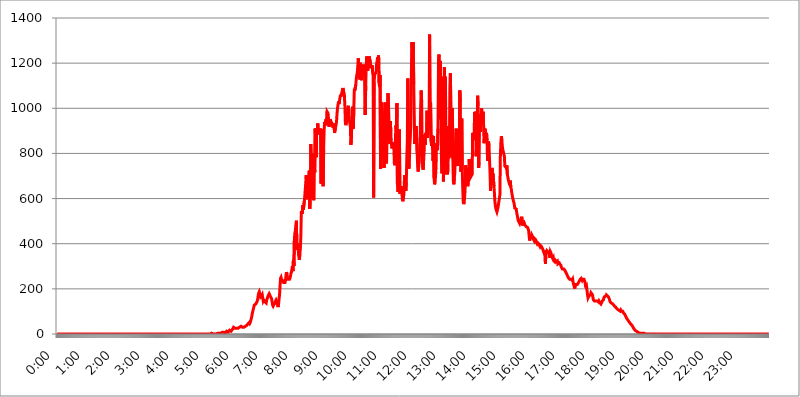
| Category | 2015.05.05. Intenzitás [W/m^2] |
|---|---|
| 0.0 | 0 |
| 0.0006944444444444445 | 0 |
| 0.001388888888888889 | 0 |
| 0.0020833333333333333 | 0 |
| 0.002777777777777778 | 0 |
| 0.003472222222222222 | 0 |
| 0.004166666666666667 | 0 |
| 0.004861111111111111 | 0 |
| 0.005555555555555556 | 0 |
| 0.0062499999999999995 | 0 |
| 0.006944444444444444 | 0 |
| 0.007638888888888889 | 0 |
| 0.008333333333333333 | 0 |
| 0.009027777777777779 | 0 |
| 0.009722222222222222 | 0 |
| 0.010416666666666666 | 0 |
| 0.011111111111111112 | 0 |
| 0.011805555555555555 | 0 |
| 0.012499999999999999 | 0 |
| 0.013194444444444444 | 0 |
| 0.013888888888888888 | 0 |
| 0.014583333333333332 | 0 |
| 0.015277777777777777 | 0 |
| 0.015972222222222224 | 0 |
| 0.016666666666666666 | 0 |
| 0.017361111111111112 | 0 |
| 0.018055555555555557 | 0 |
| 0.01875 | 0 |
| 0.019444444444444445 | 0 |
| 0.02013888888888889 | 0 |
| 0.020833333333333332 | 0 |
| 0.02152777777777778 | 0 |
| 0.022222222222222223 | 0 |
| 0.02291666666666667 | 0 |
| 0.02361111111111111 | 0 |
| 0.024305555555555556 | 0 |
| 0.024999999999999998 | 0 |
| 0.025694444444444447 | 0 |
| 0.02638888888888889 | 0 |
| 0.027083333333333334 | 0 |
| 0.027777777777777776 | 0 |
| 0.02847222222222222 | 0 |
| 0.029166666666666664 | 0 |
| 0.029861111111111113 | 0 |
| 0.030555555555555555 | 0 |
| 0.03125 | 0 |
| 0.03194444444444445 | 0 |
| 0.03263888888888889 | 0 |
| 0.03333333333333333 | 0 |
| 0.034027777777777775 | 0 |
| 0.034722222222222224 | 0 |
| 0.035416666666666666 | 0 |
| 0.036111111111111115 | 0 |
| 0.03680555555555556 | 0 |
| 0.0375 | 0 |
| 0.03819444444444444 | 0 |
| 0.03888888888888889 | 0 |
| 0.03958333333333333 | 0 |
| 0.04027777777777778 | 0 |
| 0.04097222222222222 | 0 |
| 0.041666666666666664 | 0 |
| 0.042361111111111106 | 0 |
| 0.04305555555555556 | 0 |
| 0.043750000000000004 | 0 |
| 0.044444444444444446 | 0 |
| 0.04513888888888889 | 0 |
| 0.04583333333333334 | 0 |
| 0.04652777777777778 | 0 |
| 0.04722222222222222 | 0 |
| 0.04791666666666666 | 0 |
| 0.04861111111111111 | 0 |
| 0.049305555555555554 | 0 |
| 0.049999999999999996 | 0 |
| 0.05069444444444445 | 0 |
| 0.051388888888888894 | 0 |
| 0.052083333333333336 | 0 |
| 0.05277777777777778 | 0 |
| 0.05347222222222222 | 0 |
| 0.05416666666666667 | 0 |
| 0.05486111111111111 | 0 |
| 0.05555555555555555 | 0 |
| 0.05625 | 0 |
| 0.05694444444444444 | 0 |
| 0.057638888888888885 | 0 |
| 0.05833333333333333 | 0 |
| 0.05902777777777778 | 0 |
| 0.059722222222222225 | 0 |
| 0.06041666666666667 | 0 |
| 0.061111111111111116 | 0 |
| 0.06180555555555556 | 0 |
| 0.0625 | 0 |
| 0.06319444444444444 | 0 |
| 0.06388888888888888 | 0 |
| 0.06458333333333334 | 0 |
| 0.06527777777777778 | 0 |
| 0.06597222222222222 | 0 |
| 0.06666666666666667 | 0 |
| 0.06736111111111111 | 0 |
| 0.06805555555555555 | 0 |
| 0.06874999999999999 | 0 |
| 0.06944444444444443 | 0 |
| 0.07013888888888889 | 0 |
| 0.07083333333333333 | 0 |
| 0.07152777777777779 | 0 |
| 0.07222222222222223 | 0 |
| 0.07291666666666667 | 0 |
| 0.07361111111111111 | 0 |
| 0.07430555555555556 | 0 |
| 0.075 | 0 |
| 0.07569444444444444 | 0 |
| 0.0763888888888889 | 0 |
| 0.07708333333333334 | 0 |
| 0.07777777777777778 | 0 |
| 0.07847222222222222 | 0 |
| 0.07916666666666666 | 0 |
| 0.0798611111111111 | 0 |
| 0.08055555555555556 | 0 |
| 0.08125 | 0 |
| 0.08194444444444444 | 0 |
| 0.08263888888888889 | 0 |
| 0.08333333333333333 | 0 |
| 0.08402777777777777 | 0 |
| 0.08472222222222221 | 0 |
| 0.08541666666666665 | 0 |
| 0.08611111111111112 | 0 |
| 0.08680555555555557 | 0 |
| 0.08750000000000001 | 0 |
| 0.08819444444444445 | 0 |
| 0.08888888888888889 | 0 |
| 0.08958333333333333 | 0 |
| 0.09027777777777778 | 0 |
| 0.09097222222222222 | 0 |
| 0.09166666666666667 | 0 |
| 0.09236111111111112 | 0 |
| 0.09305555555555556 | 0 |
| 0.09375 | 0 |
| 0.09444444444444444 | 0 |
| 0.09513888888888888 | 0 |
| 0.09583333333333333 | 0 |
| 0.09652777777777777 | 0 |
| 0.09722222222222222 | 0 |
| 0.09791666666666667 | 0 |
| 0.09861111111111111 | 0 |
| 0.09930555555555555 | 0 |
| 0.09999999999999999 | 0 |
| 0.10069444444444443 | 0 |
| 0.1013888888888889 | 0 |
| 0.10208333333333335 | 0 |
| 0.10277777777777779 | 0 |
| 0.10347222222222223 | 0 |
| 0.10416666666666667 | 0 |
| 0.10486111111111111 | 0 |
| 0.10555555555555556 | 0 |
| 0.10625 | 0 |
| 0.10694444444444444 | 0 |
| 0.1076388888888889 | 0 |
| 0.10833333333333334 | 0 |
| 0.10902777777777778 | 0 |
| 0.10972222222222222 | 0 |
| 0.1111111111111111 | 0 |
| 0.11180555555555556 | 0 |
| 0.11180555555555556 | 0 |
| 0.1125 | 0 |
| 0.11319444444444444 | 0 |
| 0.11388888888888889 | 0 |
| 0.11458333333333333 | 0 |
| 0.11527777777777777 | 0 |
| 0.11597222222222221 | 0 |
| 0.11666666666666665 | 0 |
| 0.1173611111111111 | 0 |
| 0.11805555555555557 | 0 |
| 0.11944444444444445 | 0 |
| 0.12013888888888889 | 0 |
| 0.12083333333333333 | 0 |
| 0.12152777777777778 | 0 |
| 0.12222222222222223 | 0 |
| 0.12291666666666667 | 0 |
| 0.12291666666666667 | 0 |
| 0.12361111111111112 | 0 |
| 0.12430555555555556 | 0 |
| 0.125 | 0 |
| 0.12569444444444444 | 0 |
| 0.12638888888888888 | 0 |
| 0.12708333333333333 | 0 |
| 0.16875 | 0 |
| 0.12847222222222224 | 0 |
| 0.12916666666666668 | 0 |
| 0.12986111111111112 | 0 |
| 0.13055555555555556 | 0 |
| 0.13125 | 0 |
| 0.13194444444444445 | 0 |
| 0.1326388888888889 | 0 |
| 0.13333333333333333 | 0 |
| 0.13402777777777777 | 0 |
| 0.13402777777777777 | 0 |
| 0.13472222222222222 | 0 |
| 0.13541666666666666 | 0 |
| 0.1361111111111111 | 0 |
| 0.13749999999999998 | 0 |
| 0.13819444444444443 | 0 |
| 0.1388888888888889 | 0 |
| 0.13958333333333334 | 0 |
| 0.14027777777777778 | 0 |
| 0.14097222222222222 | 0 |
| 0.14166666666666666 | 0 |
| 0.1423611111111111 | 0 |
| 0.14305555555555557 | 0 |
| 0.14375000000000002 | 0 |
| 0.14444444444444446 | 0 |
| 0.1451388888888889 | 0 |
| 0.1451388888888889 | 0 |
| 0.14652777777777778 | 0 |
| 0.14722222222222223 | 0 |
| 0.14791666666666667 | 0 |
| 0.1486111111111111 | 0 |
| 0.14930555555555555 | 0 |
| 0.15 | 0 |
| 0.15069444444444444 | 0 |
| 0.15138888888888888 | 0 |
| 0.15208333333333332 | 0 |
| 0.15277777777777776 | 0 |
| 0.15347222222222223 | 0 |
| 0.15416666666666667 | 0 |
| 0.15486111111111112 | 0 |
| 0.15555555555555556 | 0 |
| 0.15625 | 0 |
| 0.15694444444444444 | 0 |
| 0.15763888888888888 | 0 |
| 0.15833333333333333 | 0 |
| 0.15902777777777777 | 0 |
| 0.15972222222222224 | 0 |
| 0.16041666666666668 | 0 |
| 0.16111111111111112 | 0 |
| 0.16180555555555556 | 0 |
| 0.1625 | 0 |
| 0.16319444444444445 | 0 |
| 0.1638888888888889 | 0 |
| 0.16458333333333333 | 0 |
| 0.16527777777777777 | 0 |
| 0.16597222222222222 | 0 |
| 0.16666666666666666 | 0 |
| 0.1673611111111111 | 0 |
| 0.16805555555555554 | 0 |
| 0.16874999999999998 | 0 |
| 0.16944444444444443 | 0 |
| 0.17013888888888887 | 0 |
| 0.1708333333333333 | 0 |
| 0.17152777777777775 | 0 |
| 0.17222222222222225 | 0 |
| 0.1729166666666667 | 0 |
| 0.17361111111111113 | 0 |
| 0.17430555555555557 | 0 |
| 0.17500000000000002 | 0 |
| 0.17569444444444446 | 0 |
| 0.1763888888888889 | 0 |
| 0.17708333333333334 | 0 |
| 0.17777777777777778 | 0 |
| 0.17847222222222223 | 0 |
| 0.17916666666666667 | 0 |
| 0.1798611111111111 | 0 |
| 0.18055555555555555 | 0 |
| 0.18125 | 0 |
| 0.18194444444444444 | 0 |
| 0.1826388888888889 | 0 |
| 0.18333333333333335 | 0 |
| 0.1840277777777778 | 0 |
| 0.18472222222222223 | 0 |
| 0.18541666666666667 | 0 |
| 0.18611111111111112 | 0 |
| 0.18680555555555556 | 0 |
| 0.1875 | 0 |
| 0.18819444444444444 | 0 |
| 0.18888888888888888 | 0 |
| 0.18958333333333333 | 0 |
| 0.19027777777777777 | 0 |
| 0.1909722222222222 | 0 |
| 0.19166666666666665 | 0 |
| 0.19236111111111112 | 0 |
| 0.19305555555555554 | 0 |
| 0.19375 | 0 |
| 0.19444444444444445 | 0 |
| 0.1951388888888889 | 0 |
| 0.19583333333333333 | 0 |
| 0.19652777777777777 | 0 |
| 0.19722222222222222 | 0 |
| 0.19791666666666666 | 0 |
| 0.1986111111111111 | 0 |
| 0.19930555555555554 | 0 |
| 0.19999999999999998 | 0 |
| 0.20069444444444443 | 0 |
| 0.20138888888888887 | 0 |
| 0.2020833333333333 | 0 |
| 0.2027777777777778 | 0 |
| 0.2034722222222222 | 0 |
| 0.2041666666666667 | 0 |
| 0.20486111111111113 | 0 |
| 0.20555555555555557 | 0 |
| 0.20625000000000002 | 0 |
| 0.20694444444444446 | 0 |
| 0.2076388888888889 | 0 |
| 0.20833333333333334 | 0 |
| 0.20902777777777778 | 0 |
| 0.20972222222222223 | 0 |
| 0.21041666666666667 | 0 |
| 0.2111111111111111 | 0 |
| 0.21180555555555555 | 0 |
| 0.2125 | 0 |
| 0.21319444444444444 | 0 |
| 0.2138888888888889 | 0 |
| 0.21458333333333335 | 0 |
| 0.2152777777777778 | 0 |
| 0.21597222222222223 | 3.525 |
| 0.21666666666666667 | 3.525 |
| 0.21736111111111112 | 3.525 |
| 0.21805555555555556 | 3.525 |
| 0.21875 | 0 |
| 0.21944444444444444 | 0 |
| 0.22013888888888888 | 0 |
| 0.22083333333333333 | 0 |
| 0.22152777777777777 | 0 |
| 0.2222222222222222 | 0 |
| 0.22291666666666665 | 0 |
| 0.2236111111111111 | 0 |
| 0.22430555555555556 | 0 |
| 0.225 | 3.525 |
| 0.22569444444444445 | 3.525 |
| 0.2263888888888889 | 3.525 |
| 0.22708333333333333 | 3.525 |
| 0.22777777777777777 | 3.525 |
| 0.22847222222222222 | 3.525 |
| 0.22916666666666666 | 3.525 |
| 0.2298611111111111 | 3.525 |
| 0.23055555555555554 | 3.525 |
| 0.23124999999999998 | 7.887 |
| 0.23194444444444443 | 7.887 |
| 0.23263888888888887 | 7.887 |
| 0.2333333333333333 | 7.887 |
| 0.2340277777777778 | 7.887 |
| 0.2347222222222222 | 3.525 |
| 0.2354166666666667 | 3.525 |
| 0.23611111111111113 | 7.887 |
| 0.23680555555555557 | 7.887 |
| 0.23750000000000002 | 12.257 |
| 0.23819444444444446 | 7.887 |
| 0.2388888888888889 | 7.887 |
| 0.23958333333333334 | 7.887 |
| 0.24027777777777778 | 12.257 |
| 0.24097222222222223 | 12.257 |
| 0.24166666666666667 | 16.636 |
| 0.2423611111111111 | 12.257 |
| 0.24305555555555555 | 12.257 |
| 0.24375 | 12.257 |
| 0.24444444444444446 | 12.257 |
| 0.24513888888888888 | 12.257 |
| 0.24583333333333335 | 21.024 |
| 0.2465277777777778 | 25.419 |
| 0.24722222222222223 | 29.823 |
| 0.24791666666666667 | 29.823 |
| 0.24861111111111112 | 29.823 |
| 0.24930555555555556 | 25.419 |
| 0.25 | 21.024 |
| 0.25069444444444444 | 21.024 |
| 0.2513888888888889 | 25.419 |
| 0.2520833333333333 | 25.419 |
| 0.25277777777777777 | 25.419 |
| 0.2534722222222222 | 25.419 |
| 0.25416666666666665 | 25.419 |
| 0.2548611111111111 | 29.823 |
| 0.2555555555555556 | 29.823 |
| 0.25625000000000003 | 29.823 |
| 0.2569444444444445 | 34.234 |
| 0.2576388888888889 | 34.234 |
| 0.25833333333333336 | 34.234 |
| 0.2590277777777778 | 29.823 |
| 0.25972222222222224 | 29.823 |
| 0.2604166666666667 | 29.823 |
| 0.2611111111111111 | 29.823 |
| 0.26180555555555557 | 29.823 |
| 0.2625 | 29.823 |
| 0.26319444444444445 | 29.823 |
| 0.2638888888888889 | 34.234 |
| 0.26458333333333334 | 38.653 |
| 0.2652777777777778 | 38.653 |
| 0.2659722222222222 | 38.653 |
| 0.26666666666666666 | 43.079 |
| 0.2673611111111111 | 43.079 |
| 0.26805555555555555 | 47.511 |
| 0.26875 | 47.511 |
| 0.26944444444444443 | 51.951 |
| 0.2701388888888889 | 47.511 |
| 0.2708333333333333 | 51.951 |
| 0.27152777777777776 | 60.85 |
| 0.2722222222222222 | 69.775 |
| 0.27291666666666664 | 78.722 |
| 0.2736111111111111 | 92.184 |
| 0.2743055555555555 | 101.184 |
| 0.27499999999999997 | 110.201 |
| 0.27569444444444446 | 119.235 |
| 0.27638888888888885 | 128.284 |
| 0.27708333333333335 | 128.284 |
| 0.2777777777777778 | 128.284 |
| 0.27847222222222223 | 132.814 |
| 0.2791666666666667 | 137.347 |
| 0.2798611111111111 | 141.884 |
| 0.28055555555555556 | 146.423 |
| 0.28125 | 155.509 |
| 0.28194444444444444 | 173.709 |
| 0.2826388888888889 | 182.82 |
| 0.2833333333333333 | 187.378 |
| 0.28402777777777777 | 178.264 |
| 0.2847222222222222 | 173.709 |
| 0.28541666666666665 | 164.605 |
| 0.28611111111111115 | 164.605 |
| 0.28680555555555554 | 169.156 |
| 0.28750000000000003 | 173.709 |
| 0.2881944444444445 | 160.056 |
| 0.2888888888888889 | 146.423 |
| 0.28958333333333336 | 150.964 |
| 0.2902777777777778 | 150.964 |
| 0.29097222222222224 | 146.423 |
| 0.2916666666666667 | 141.884 |
| 0.2923611111111111 | 141.884 |
| 0.29305555555555557 | 137.347 |
| 0.29375 | 150.964 |
| 0.29444444444444445 | 155.509 |
| 0.2951388888888889 | 164.605 |
| 0.29583333333333334 | 169.156 |
| 0.2965277777777778 | 173.709 |
| 0.2972222222222222 | 178.264 |
| 0.29791666666666666 | 173.709 |
| 0.2986111111111111 | 169.156 |
| 0.29930555555555555 | 164.605 |
| 0.3 | 164.605 |
| 0.30069444444444443 | 155.509 |
| 0.3013888888888889 | 141.884 |
| 0.3020833333333333 | 128.284 |
| 0.30277777777777776 | 123.758 |
| 0.3034722222222222 | 128.284 |
| 0.30416666666666664 | 132.814 |
| 0.3048611111111111 | 132.814 |
| 0.3055555555555555 | 137.347 |
| 0.30624999999999997 | 146.423 |
| 0.3069444444444444 | 150.964 |
| 0.3076388888888889 | 146.423 |
| 0.30833333333333335 | 132.814 |
| 0.3090277777777778 | 128.284 |
| 0.30972222222222223 | 119.235 |
| 0.3104166666666667 | 132.814 |
| 0.3111111111111111 | 155.509 |
| 0.31180555555555556 | 173.709 |
| 0.3125 | 214.746 |
| 0.31319444444444444 | 246.689 |
| 0.3138888888888889 | 251.251 |
| 0.3145833333333333 | 242.127 |
| 0.31527777777777777 | 242.127 |
| 0.3159722222222222 | 237.564 |
| 0.31666666666666665 | 233 |
| 0.31736111111111115 | 228.436 |
| 0.31805555555555554 | 228.436 |
| 0.31875000000000003 | 228.436 |
| 0.3194444444444445 | 228.436 |
| 0.3201388888888889 | 237.564 |
| 0.32083333333333336 | 260.373 |
| 0.3215277777777778 | 274.047 |
| 0.32222222222222224 | 264.932 |
| 0.3229166666666667 | 251.251 |
| 0.3236111111111111 | 242.127 |
| 0.32430555555555557 | 242.127 |
| 0.325 | 242.127 |
| 0.32569444444444445 | 242.127 |
| 0.3263888888888889 | 246.689 |
| 0.32708333333333334 | 255.813 |
| 0.3277777777777778 | 269.49 |
| 0.3284722222222222 | 274.047 |
| 0.32916666666666666 | 287.709 |
| 0.3298611111111111 | 301.354 |
| 0.33055555555555555 | 278.603 |
| 0.33125 | 328.584 |
| 0.33194444444444443 | 301.354 |
| 0.3326388888888889 | 422.943 |
| 0.3333333333333333 | 449.551 |
| 0.3340277777777778 | 458.38 |
| 0.3347222222222222 | 484.735 |
| 0.3354166666666667 | 502.192 |
| 0.3361111111111111 | 373.729 |
| 0.3368055555555556 | 400.638 |
| 0.33749999999999997 | 387.202 |
| 0.33819444444444446 | 364.728 |
| 0.33888888888888885 | 369.23 |
| 0.33958333333333335 | 328.584 |
| 0.34027777777777773 | 355.712 |
| 0.34097222222222223 | 378.224 |
| 0.3416666666666666 | 436.27 |
| 0.3423611111111111 | 545.416 |
| 0.3430555555555555 | 549.704 |
| 0.34375 | 532.513 |
| 0.3444444444444445 | 571.049 |
| 0.3451388888888889 | 549.704 |
| 0.3458333333333334 | 545.416 |
| 0.34652777777777777 | 588.009 |
| 0.34722222222222227 | 613.252 |
| 0.34791666666666665 | 642.4 |
| 0.34861111111111115 | 638.256 |
| 0.34930555555555554 | 703.762 |
| 0.35000000000000003 | 609.062 |
| 0.3506944444444444 | 609.062 |
| 0.3513888888888889 | 596.45 |
| 0.3520833333333333 | 592.233 |
| 0.3527777777777778 | 695.666 |
| 0.3534722222222222 | 723.889 |
| 0.3541666666666667 | 553.986 |
| 0.3548611111111111 | 617.436 |
| 0.35555555555555557 | 841.526 |
| 0.35625 | 759.723 |
| 0.35694444444444445 | 600.661 |
| 0.3576388888888889 | 759.723 |
| 0.35833333333333334 | 798.974 |
| 0.3590277777777778 | 787.258 |
| 0.3597222222222222 | 592.233 |
| 0.36041666666666666 | 771.559 |
| 0.3611111111111111 | 715.858 |
| 0.36180555555555555 | 909.996 |
| 0.3625 | 856.855 |
| 0.36319444444444443 | 783.342 |
| 0.3638888888888889 | 906.223 |
| 0.3645833333333333 | 883.516 |
| 0.3652777777777778 | 932.576 |
| 0.3659722222222222 | 909.996 |
| 0.3666666666666667 | 898.668 |
| 0.3673611111111111 | 906.223 |
| 0.3680555555555556 | 894.885 |
| 0.36874999999999997 | 898.668 |
| 0.36944444444444446 | 909.996 |
| 0.37013888888888885 | 667.123 |
| 0.37083333333333335 | 906.223 |
| 0.37152777777777773 | 868.305 |
| 0.37222222222222223 | 739.877 |
| 0.3729166666666666 | 654.791 |
| 0.3736111111111111 | 818.392 |
| 0.3743055555555555 | 902.447 |
| 0.375 | 940.082 |
| 0.3756944444444445 | 928.819 |
| 0.3763888888888889 | 928.819 |
| 0.3770833333333334 | 951.327 |
| 0.37777777777777777 | 925.06 |
| 0.37847222222222227 | 984.98 |
| 0.37916666666666665 | 984.98 |
| 0.37986111111111115 | 977.508 |
| 0.38055555555555554 | 973.772 |
| 0.38125000000000003 | 917.534 |
| 0.3819444444444444 | 917.534 |
| 0.3826388888888889 | 951.327 |
| 0.3833333333333333 | 955.071 |
| 0.3840277777777778 | 940.082 |
| 0.3847222222222222 | 940.082 |
| 0.3854166666666667 | 932.576 |
| 0.3861111111111111 | 936.33 |
| 0.38680555555555557 | 913.766 |
| 0.3875 | 921.298 |
| 0.38819444444444445 | 932.576 |
| 0.3888888888888889 | 891.099 |
| 0.38958333333333334 | 891.099 |
| 0.3902777777777778 | 913.766 |
| 0.3909722222222222 | 917.534 |
| 0.39166666666666666 | 940.082 |
| 0.3923611111111111 | 973.772 |
| 0.39305555555555555 | 999.916 |
| 0.39375 | 996.182 |
| 0.39444444444444443 | 1029.798 |
| 0.3951388888888889 | 1018.587 |
| 0.3958333333333333 | 1033.537 |
| 0.3965277777777778 | 1029.798 |
| 0.3972222222222222 | 1059.756 |
| 0.3979166666666667 | 1052.255 |
| 0.3986111111111111 | 1063.51 |
| 0.3993055555555556 | 1071.027 |
| 0.39999999999999997 | 1082.324 |
| 0.40069444444444446 | 1089.873 |
| 0.40138888888888885 | 1089.873 |
| 0.40208333333333335 | 1089.873 |
| 0.40277777777777773 | 1052.255 |
| 0.40347222222222223 | 1007.383 |
| 0.4041666666666666 | 932.576 |
| 0.4048611111111111 | 925.06 |
| 0.4055555555555555 | 940.082 |
| 0.40625 | 943.832 |
| 0.4069444444444445 | 988.714 |
| 0.4076388888888889 | 1003.65 |
| 0.4083333333333334 | 1011.118 |
| 0.40902777777777777 | 981.244 |
| 0.40972222222222227 | 947.58 |
| 0.41041666666666665 | 932.576 |
| 0.41111111111111115 | 917.534 |
| 0.41180555555555554 | 837.682 |
| 0.41250000000000003 | 860.676 |
| 0.4131944444444444 | 936.33 |
| 0.4138888888888889 | 992.448 |
| 0.4145833333333333 | 1007.383 |
| 0.4152777777777778 | 909.996 |
| 0.4159722222222222 | 1003.65 |
| 0.4166666666666667 | 1086.097 |
| 0.4173611111111111 | 1078.555 |
| 0.41805555555555557 | 1074.789 |
| 0.41875 | 1105.019 |
| 0.41944444444444445 | 1131.708 |
| 0.4201388888888889 | 1147.086 |
| 0.42083333333333334 | 1158.689 |
| 0.4215277777777778 | 1186.03 |
| 0.4222222222222222 | 1221.83 |
| 0.42291666666666666 | 1217.812 |
| 0.4236111111111111 | 1162.571 |
| 0.42430555555555555 | 1127.879 |
| 0.425 | 1201.843 |
| 0.42569444444444443 | 1154.814 |
| 0.4263888888888889 | 1150.946 |
| 0.4270833333333333 | 1124.056 |
| 0.4277777777777778 | 1174.263 |
| 0.4284722222222222 | 1150.946 |
| 0.4291666666666667 | 1186.03 |
| 0.4298611111111111 | 1193.918 |
| 0.4305555555555556 | 1166.46 |
| 0.43124999999999997 | 1186.03 |
| 0.43194444444444446 | 970.034 |
| 0.43263888888888885 | 1101.226 |
| 0.43333333333333335 | 1186.03 |
| 0.43402777777777773 | 1229.899 |
| 0.43472222222222223 | 1229.899 |
| 0.4354166666666666 | 1166.46 |
| 0.4361111111111111 | 1189.969 |
| 0.4368055555555555 | 1186.03 |
| 0.4375 | 1229.899 |
| 0.4381944444444445 | 1229.899 |
| 0.4388888888888889 | 1205.82 |
| 0.4395833333333334 | 1178.177 |
| 0.44027777777777777 | 1186.03 |
| 0.44097222222222227 | 1178.177 |
| 0.44166666666666665 | 1189.969 |
| 0.44236111111111115 | 1158.689 |
| 0.44305555555555554 | 1143.232 |
| 0.44375000000000003 | 604.864 |
| 0.4444444444444444 | 1116.426 |
| 0.4451388888888889 | 1147.086 |
| 0.4458333333333333 | 1147.086 |
| 0.4465277777777778 | 1143.232 |
| 0.4472222222222222 | 1162.571 |
| 0.4479166666666667 | 1197.876 |
| 0.4486111111111111 | 1209.807 |
| 0.44930555555555557 | 1225.859 |
| 0.45 | 1213.804 |
| 0.45069444444444445 | 1233.951 |
| 0.4513888888888889 | 1112.618 |
| 0.45208333333333334 | 1093.653 |
| 0.4527777777777778 | 1147.086 |
| 0.4534722222222222 | 731.896 |
| 0.45416666666666666 | 1026.06 |
| 0.4548611111111111 | 1026.06 |
| 0.45555555555555555 | 1014.852 |
| 0.45625 | 977.508 |
| 0.45694444444444443 | 775.492 |
| 0.4576388888888889 | 822.26 |
| 0.4583333333333333 | 735.89 |
| 0.4590277777777778 | 856.855 |
| 0.4597222222222222 | 1026.06 |
| 0.4604166666666667 | 1007.383 |
| 0.4611111111111111 | 763.674 |
| 0.4618055555555556 | 755.766 |
| 0.46249999999999997 | 970.034 |
| 0.46319444444444446 | 1022.323 |
| 0.46388888888888885 | 1067.267 |
| 0.46458333333333335 | 1014.852 |
| 0.46527777777777773 | 943.832 |
| 0.46597222222222223 | 853.029 |
| 0.4666666666666666 | 841.526 |
| 0.4673611111111111 | 943.832 |
| 0.4680555555555555 | 849.199 |
| 0.46875 | 841.526 |
| 0.4694444444444445 | 822.26 |
| 0.4701388888888889 | 837.682 |
| 0.4708333333333334 | 849.199 |
| 0.47152777777777777 | 841.526 |
| 0.47222222222222227 | 814.519 |
| 0.47291666666666665 | 747.834 |
| 0.47361111111111115 | 779.42 |
| 0.47430555555555554 | 864.493 |
| 0.47500000000000003 | 925.06 |
| 0.4756944444444444 | 906.223 |
| 0.4763888888888889 | 1022.323 |
| 0.4770833333333333 | 667.123 |
| 0.4777777777777778 | 629.948 |
| 0.4784722222222222 | 642.4 |
| 0.4791666666666667 | 654.791 |
| 0.4798611111111111 | 906.223 |
| 0.48055555555555557 | 621.613 |
| 0.48125 | 617.436 |
| 0.48194444444444445 | 642.4 |
| 0.4826388888888889 | 654.791 |
| 0.48333333333333334 | 629.948 |
| 0.4840277777777778 | 596.45 |
| 0.4847222222222222 | 588.009 |
| 0.48541666666666666 | 583.779 |
| 0.4861111111111111 | 621.613 |
| 0.48680555555555555 | 675.311 |
| 0.4875 | 703.762 |
| 0.48819444444444443 | 663.019 |
| 0.4888888888888889 | 634.105 |
| 0.4895833333333333 | 671.22 |
| 0.4902777777777778 | 783.342 |
| 0.4909722222222222 | 849.199 |
| 0.4916666666666667 | 1131.708 |
| 0.4923611111111111 | 913.766 |
| 0.4930555555555556 | 731.896 |
| 0.49374999999999997 | 751.803 |
| 0.49444444444444446 | 833.834 |
| 0.49513888888888885 | 864.493 |
| 0.49583333333333335 | 921.298 |
| 0.49652777777777773 | 1108.816 |
| 0.49722222222222223 | 1291.997 |
| 0.4979166666666666 | 1287.761 |
| 0.4986111111111111 | 1246.176 |
| 0.4993055555555555 | 1291.997 |
| 0.5 | 1105.019 |
| 0.5006944444444444 | 970.034 |
| 0.5013888888888889 | 841.526 |
| 0.5020833333333333 | 898.668 |
| 0.5027777777777778 | 913.766 |
| 0.5034722222222222 | 921.298 |
| 0.5041666666666667 | 917.534 |
| 0.5048611111111111 | 798.974 |
| 0.5055555555555555 | 735.89 |
| 0.50625 | 719.877 |
| 0.5069444444444444 | 743.859 |
| 0.5076388888888889 | 759.723 |
| 0.5083333333333333 | 810.641 |
| 0.5090277777777777 | 864.493 |
| 0.5097222222222222 | 1007.383 |
| 0.5104166666666666 | 1078.555 |
| 0.5111111111111112 | 1029.798 |
| 0.5118055555555555 | 814.519 |
| 0.5125000000000001 | 735.89 |
| 0.5131944444444444 | 727.896 |
| 0.513888888888889 | 771.559 |
| 0.5145833333333333 | 810.641 |
| 0.5152777777777778 | 883.516 |
| 0.5159722222222222 | 837.682 |
| 0.5166666666666667 | 891.099 |
| 0.517361111111111 | 883.516 |
| 0.5180555555555556 | 875.918 |
| 0.5187499999999999 | 988.714 |
| 0.5194444444444445 | 868.305 |
| 0.5201388888888888 | 906.223 |
| 0.5208333333333334 | 902.447 |
| 0.5215277777777778 | 917.534 |
| 0.5222222222222223 | 1326.445 |
| 0.5229166666666667 | 962.555 |
| 0.5236111111111111 | 1026.06 |
| 0.5243055555555556 | 853.029 |
| 0.525 | 833.834 |
| 0.5256944444444445 | 879.719 |
| 0.5263888888888889 | 826.123 |
| 0.5270833333333333 | 767.62 |
| 0.5277777777777778 | 875.918 |
| 0.5284722222222222 | 691.608 |
| 0.5291666666666667 | 663.019 |
| 0.5298611111111111 | 671.22 |
| 0.5305555555555556 | 699.717 |
| 0.53125 | 739.877 |
| 0.5319444444444444 | 845.365 |
| 0.5326388888888889 | 849.199 |
| 0.5333333333333333 | 814.519 |
| 0.5340277777777778 | 909.996 |
| 0.5347222222222222 | 1209.807 |
| 0.5354166666666667 | 1238.014 |
| 0.5361111111111111 | 951.327 |
| 0.5368055555555555 | 1209.807 |
| 0.5375 | 1197.876 |
| 0.5381944444444444 | 1014.852 |
| 0.5388888888888889 | 767.62 |
| 0.5395833333333333 | 711.832 |
| 0.5402777777777777 | 1139.384 |
| 0.5409722222222222 | 1101.226 |
| 0.5416666666666666 | 675.311 |
| 0.5423611111111112 | 1022.323 |
| 0.5430555555555555 | 1182.099 |
| 0.5437500000000001 | 928.819 |
| 0.5444444444444444 | 1139.384 |
| 0.545138888888889 | 715.858 |
| 0.5458333333333333 | 707.8 |
| 0.5465277777777778 | 921.298 |
| 0.5472222222222222 | 707.8 |
| 0.5479166666666667 | 727.896 |
| 0.548611111111111 | 822.26 |
| 0.5493055555555556 | 779.42 |
| 0.5499999999999999 | 826.123 |
| 0.5506944444444445 | 1097.437 |
| 0.5513888888888888 | 1154.814 |
| 0.5520833333333334 | 1154.814 |
| 0.5527777777777778 | 787.258 |
| 0.5534722222222223 | 883.516 |
| 0.5541666666666667 | 999.916 |
| 0.5548611111111111 | 775.492 |
| 0.5555555555555556 | 675.311 |
| 0.55625 | 663.019 |
| 0.5569444444444445 | 691.608 |
| 0.5576388888888889 | 715.858 |
| 0.5583333333333333 | 719.877 |
| 0.5590277777777778 | 902.447 |
| 0.5597222222222222 | 909.996 |
| 0.5604166666666667 | 849.199 |
| 0.5611111111111111 | 775.492 |
| 0.5618055555555556 | 743.859 |
| 0.5625 | 849.199 |
| 0.5631944444444444 | 833.834 |
| 0.5638888888888889 | 763.674 |
| 0.5645833333333333 | 1078.555 |
| 0.5652777777777778 | 1026.06 |
| 0.5659722222222222 | 719.877 |
| 0.5666666666666667 | 759.723 |
| 0.5673611111111111 | 955.071 |
| 0.5680555555555555 | 727.896 |
| 0.56875 | 642.4 |
| 0.5694444444444444 | 583.779 |
| 0.5701388888888889 | 575.299 |
| 0.5708333333333333 | 588.009 |
| 0.5715277777777777 | 613.252 |
| 0.5722222222222222 | 658.909 |
| 0.5729166666666666 | 747.834 |
| 0.5736111111111112 | 691.608 |
| 0.5743055555555555 | 735.89 |
| 0.5750000000000001 | 675.311 |
| 0.5756944444444444 | 654.791 |
| 0.576388888888889 | 667.123 |
| 0.5770833333333333 | 719.877 |
| 0.5777777777777778 | 775.492 |
| 0.5784722222222222 | 743.859 |
| 0.5791666666666667 | 691.608 |
| 0.579861111111111 | 691.608 |
| 0.5805555555555556 | 699.717 |
| 0.5812499999999999 | 695.666 |
| 0.5819444444444445 | 707.8 |
| 0.5826388888888888 | 891.099 |
| 0.5833333333333334 | 860.676 |
| 0.5840277777777778 | 868.305 |
| 0.5847222222222223 | 894.885 |
| 0.5854166666666667 | 984.98 |
| 0.5861111111111111 | 977.508 |
| 0.5868055555555556 | 921.298 |
| 0.5875 | 787.258 |
| 0.5881944444444445 | 833.834 |
| 0.5888888888888889 | 883.516 |
| 0.5895833333333333 | 1056.004 |
| 0.5902777777777778 | 1011.118 |
| 0.5909722222222222 | 735.89 |
| 0.5916666666666667 | 759.723 |
| 0.5923611111111111 | 973.772 |
| 0.5930555555555556 | 921.298 |
| 0.59375 | 894.885 |
| 0.5944444444444444 | 973.772 |
| 0.5951388888888889 | 999.916 |
| 0.5958333333333333 | 966.295 |
| 0.5965277777777778 | 951.327 |
| 0.5972222222222222 | 984.98 |
| 0.5979166666666667 | 936.33 |
| 0.5986111111111111 | 845.365 |
| 0.5993055555555555 | 872.114 |
| 0.6 | 909.996 |
| 0.6006944444444444 | 872.114 |
| 0.6013888888888889 | 883.516 |
| 0.6020833333333333 | 891.099 |
| 0.6027777777777777 | 856.855 |
| 0.6034722222222222 | 767.62 |
| 0.6041666666666666 | 837.682 |
| 0.6048611111111112 | 853.029 |
| 0.6055555555555555 | 833.834 |
| 0.6062500000000001 | 775.492 |
| 0.6069444444444444 | 719.877 |
| 0.607638888888889 | 634.105 |
| 0.6083333333333333 | 679.395 |
| 0.6090277777777778 | 671.22 |
| 0.6097222222222222 | 735.89 |
| 0.6104166666666667 | 703.762 |
| 0.611111111111111 | 711.832 |
| 0.6118055555555556 | 711.832 |
| 0.6124999999999999 | 654.791 |
| 0.6131944444444445 | 621.613 |
| 0.6138888888888888 | 583.779 |
| 0.6145833333333334 | 566.793 |
| 0.6152777777777778 | 553.986 |
| 0.6159722222222223 | 549.704 |
| 0.6166666666666667 | 541.121 |
| 0.6173611111111111 | 545.416 |
| 0.6180555555555556 | 558.261 |
| 0.61875 | 558.261 |
| 0.6194444444444445 | 588.009 |
| 0.6201388888888889 | 592.233 |
| 0.6208333333333333 | 617.436 |
| 0.6215277777777778 | 795.074 |
| 0.6222222222222222 | 849.199 |
| 0.6229166666666667 | 875.918 |
| 0.6236111111111111 | 856.855 |
| 0.6243055555555556 | 829.981 |
| 0.625 | 814.519 |
| 0.6256944444444444 | 806.757 |
| 0.6263888888888889 | 802.868 |
| 0.6270833333333333 | 787.258 |
| 0.6277777777777778 | 743.859 |
| 0.6284722222222222 | 743.859 |
| 0.6291666666666667 | 747.834 |
| 0.6298611111111111 | 735.89 |
| 0.6305555555555555 | 747.834 |
| 0.63125 | 707.8 |
| 0.6319444444444444 | 703.762 |
| 0.6326388888888889 | 683.473 |
| 0.6333333333333333 | 687.544 |
| 0.6340277777777777 | 683.473 |
| 0.6347222222222222 | 658.909 |
| 0.6354166666666666 | 679.395 |
| 0.6361111111111112 | 650.667 |
| 0.6368055555555555 | 642.4 |
| 0.6375000000000001 | 625.784 |
| 0.6381944444444444 | 621.613 |
| 0.638888888888889 | 600.661 |
| 0.6395833333333333 | 600.661 |
| 0.6402777777777778 | 583.779 |
| 0.6409722222222222 | 575.299 |
| 0.6416666666666667 | 558.261 |
| 0.642361111111111 | 558.261 |
| 0.6430555555555556 | 558.261 |
| 0.6437499999999999 | 553.986 |
| 0.6444444444444445 | 536.82 |
| 0.6451388888888888 | 536.82 |
| 0.6458333333333334 | 515.223 |
| 0.6465277777777778 | 502.192 |
| 0.6472222222222223 | 502.192 |
| 0.6479166666666667 | 502.192 |
| 0.6486111111111111 | 489.108 |
| 0.6493055555555556 | 489.108 |
| 0.65 | 502.192 |
| 0.6506944444444445 | 510.885 |
| 0.6513888888888889 | 519.555 |
| 0.6520833333333333 | 502.192 |
| 0.6527777777777778 | 480.356 |
| 0.6534722222222222 | 502.192 |
| 0.6541666666666667 | 502.192 |
| 0.6548611111111111 | 497.836 |
| 0.6555555555555556 | 484.735 |
| 0.65625 | 489.108 |
| 0.6569444444444444 | 480.356 |
| 0.6576388888888889 | 475.972 |
| 0.6583333333333333 | 471.582 |
| 0.6590277777777778 | 480.356 |
| 0.6597222222222222 | 471.582 |
| 0.6604166666666667 | 467.187 |
| 0.6611111111111111 | 458.38 |
| 0.6618055555555555 | 453.968 |
| 0.6625 | 414.035 |
| 0.6631944444444444 | 422.943 |
| 0.6638888888888889 | 422.943 |
| 0.6645833333333333 | 431.833 |
| 0.6652777777777777 | 440.702 |
| 0.6659722222222222 | 436.27 |
| 0.6666666666666666 | 431.833 |
| 0.6673611111111111 | 427.39 |
| 0.6680555555555556 | 418.492 |
| 0.6687500000000001 | 414.035 |
| 0.6694444444444444 | 422.943 |
| 0.6701388888888888 | 422.943 |
| 0.6708333333333334 | 418.492 |
| 0.6715277777777778 | 418.492 |
| 0.6722222222222222 | 405.108 |
| 0.6729166666666666 | 400.638 |
| 0.6736111111111112 | 405.108 |
| 0.6743055555555556 | 405.108 |
| 0.6749999999999999 | 400.638 |
| 0.6756944444444444 | 396.164 |
| 0.6763888888888889 | 391.685 |
| 0.6770833333333334 | 387.202 |
| 0.6777777777777777 | 391.685 |
| 0.6784722222222223 | 391.685 |
| 0.6791666666666667 | 387.202 |
| 0.6798611111111111 | 382.715 |
| 0.6805555555555555 | 378.224 |
| 0.68125 | 373.729 |
| 0.6819444444444445 | 364.728 |
| 0.6826388888888889 | 360.221 |
| 0.6833333333333332 | 364.728 |
| 0.6840277777777778 | 369.23 |
| 0.6847222222222222 | 310.44 |
| 0.6854166666666667 | 369.23 |
| 0.686111111111111 | 360.221 |
| 0.6868055555555556 | 369.23 |
| 0.6875 | 369.23 |
| 0.6881944444444444 | 364.728 |
| 0.688888888888889 | 360.221 |
| 0.6895833333333333 | 355.712 |
| 0.6902777777777778 | 351.198 |
| 0.6909722222222222 | 337.639 |
| 0.6916666666666668 | 364.728 |
| 0.6923611111111111 | 360.221 |
| 0.6930555555555555 | 351.198 |
| 0.69375 | 342.162 |
| 0.6944444444444445 | 337.639 |
| 0.6951388888888889 | 333.113 |
| 0.6958333333333333 | 337.639 |
| 0.6965277777777777 | 324.052 |
| 0.6972222222222223 | 324.052 |
| 0.6979166666666666 | 319.517 |
| 0.6986111111111111 | 324.052 |
| 0.6993055555555556 | 319.517 |
| 0.7000000000000001 | 319.517 |
| 0.7006944444444444 | 319.517 |
| 0.7013888888888888 | 324.052 |
| 0.7020833333333334 | 310.44 |
| 0.7027777777777778 | 310.44 |
| 0.7034722222222222 | 310.44 |
| 0.7041666666666666 | 314.98 |
| 0.7048611111111112 | 310.44 |
| 0.7055555555555556 | 310.44 |
| 0.7062499999999999 | 305.898 |
| 0.7069444444444444 | 296.808 |
| 0.7076388888888889 | 296.808 |
| 0.7083333333333334 | 287.709 |
| 0.7090277777777777 | 287.709 |
| 0.7097222222222223 | 287.709 |
| 0.7104166666666667 | 287.709 |
| 0.7111111111111111 | 287.709 |
| 0.7118055555555555 | 283.156 |
| 0.7125 | 278.603 |
| 0.7131944444444445 | 274.047 |
| 0.7138888888888889 | 269.49 |
| 0.7145833333333332 | 264.932 |
| 0.7152777777777778 | 260.373 |
| 0.7159722222222222 | 260.373 |
| 0.7166666666666667 | 251.251 |
| 0.717361111111111 | 246.689 |
| 0.7180555555555556 | 246.689 |
| 0.71875 | 242.127 |
| 0.7194444444444444 | 242.127 |
| 0.720138888888889 | 242.127 |
| 0.7208333333333333 | 242.127 |
| 0.7215277777777778 | 242.127 |
| 0.7222222222222222 | 237.564 |
| 0.7229166666666668 | 242.127 |
| 0.7236111111111111 | 228.436 |
| 0.7243055555555555 | 219.309 |
| 0.725 | 210.182 |
| 0.7256944444444445 | 201.058 |
| 0.7263888888888889 | 214.746 |
| 0.7270833333333333 | 219.309 |
| 0.7277777777777777 | 219.309 |
| 0.7284722222222223 | 219.309 |
| 0.7291666666666666 | 219.309 |
| 0.7298611111111111 | 219.309 |
| 0.7305555555555556 | 223.873 |
| 0.7312500000000001 | 228.436 |
| 0.7319444444444444 | 233 |
| 0.7326388888888888 | 237.564 |
| 0.7333333333333334 | 242.127 |
| 0.7340277777777778 | 242.127 |
| 0.7347222222222222 | 246.689 |
| 0.7354166666666666 | 246.689 |
| 0.7361111111111112 | 237.564 |
| 0.7368055555555556 | 242.127 |
| 0.7374999999999999 | 242.127 |
| 0.7381944444444444 | 242.127 |
| 0.7388888888888889 | 242.127 |
| 0.7395833333333334 | 242.127 |
| 0.7402777777777777 | 228.436 |
| 0.7409722222222223 | 210.182 |
| 0.7416666666666667 | 205.62 |
| 0.7423611111111111 | 210.182 |
| 0.7430555555555555 | 191.937 |
| 0.74375 | 173.709 |
| 0.7444444444444445 | 160.056 |
| 0.7451388888888889 | 160.056 |
| 0.7458333333333332 | 169.156 |
| 0.7465277777777778 | 169.156 |
| 0.7472222222222222 | 169.156 |
| 0.7479166666666667 | 173.709 |
| 0.748611111111111 | 182.82 |
| 0.7493055555555556 | 182.82 |
| 0.75 | 182.82 |
| 0.7506944444444444 | 173.709 |
| 0.751388888888889 | 160.056 |
| 0.7520833333333333 | 150.964 |
| 0.7527777777777778 | 150.964 |
| 0.7534722222222222 | 146.423 |
| 0.7541666666666668 | 146.423 |
| 0.7548611111111111 | 146.423 |
| 0.7555555555555555 | 146.423 |
| 0.75625 | 146.423 |
| 0.7569444444444445 | 146.423 |
| 0.7576388888888889 | 146.423 |
| 0.7583333333333333 | 146.423 |
| 0.7590277777777777 | 141.884 |
| 0.7597222222222223 | 146.423 |
| 0.7604166666666666 | 141.884 |
| 0.7611111111111111 | 137.347 |
| 0.7618055555555556 | 137.347 |
| 0.7625000000000001 | 132.814 |
| 0.7631944444444444 | 137.347 |
| 0.7638888888888888 | 141.884 |
| 0.7645833333333334 | 146.423 |
| 0.7652777777777778 | 146.423 |
| 0.7659722222222222 | 150.964 |
| 0.7666666666666666 | 160.056 |
| 0.7673611111111112 | 164.605 |
| 0.7680555555555556 | 164.605 |
| 0.7687499999999999 | 164.605 |
| 0.7694444444444444 | 169.156 |
| 0.7701388888888889 | 173.709 |
| 0.7708333333333334 | 173.709 |
| 0.7715277777777777 | 169.156 |
| 0.7722222222222223 | 169.156 |
| 0.7729166666666667 | 164.605 |
| 0.7736111111111111 | 160.056 |
| 0.7743055555555555 | 155.509 |
| 0.775 | 146.423 |
| 0.7756944444444445 | 141.884 |
| 0.7763888888888889 | 141.884 |
| 0.7770833333333332 | 137.347 |
| 0.7777777777777778 | 137.347 |
| 0.7784722222222222 | 137.347 |
| 0.7791666666666667 | 132.814 |
| 0.779861111111111 | 132.814 |
| 0.7805555555555556 | 128.284 |
| 0.78125 | 123.758 |
| 0.7819444444444444 | 123.758 |
| 0.782638888888889 | 123.758 |
| 0.7833333333333333 | 119.235 |
| 0.7840277777777778 | 114.716 |
| 0.7847222222222222 | 114.716 |
| 0.7854166666666668 | 110.201 |
| 0.7861111111111111 | 110.201 |
| 0.7868055555555555 | 110.201 |
| 0.7875 | 105.69 |
| 0.7881944444444445 | 105.69 |
| 0.7888888888888889 | 105.69 |
| 0.7895833333333333 | 101.184 |
| 0.7902777777777777 | 105.69 |
| 0.7909722222222223 | 101.184 |
| 0.7916666666666666 | 101.184 |
| 0.7923611111111111 | 101.184 |
| 0.7930555555555556 | 101.184 |
| 0.7937500000000001 | 96.682 |
| 0.7944444444444444 | 92.184 |
| 0.7951388888888888 | 92.184 |
| 0.7958333333333334 | 87.692 |
| 0.7965277777777778 | 83.205 |
| 0.7972222222222222 | 78.722 |
| 0.7979166666666666 | 74.246 |
| 0.7986111111111112 | 69.775 |
| 0.7993055555555556 | 65.31 |
| 0.7999999999999999 | 65.31 |
| 0.8006944444444444 | 60.85 |
| 0.8013888888888889 | 56.398 |
| 0.8020833333333334 | 56.398 |
| 0.8027777777777777 | 51.951 |
| 0.8034722222222223 | 47.511 |
| 0.8041666666666667 | 47.511 |
| 0.8048611111111111 | 43.079 |
| 0.8055555555555555 | 38.653 |
| 0.80625 | 38.653 |
| 0.8069444444444445 | 34.234 |
| 0.8076388888888889 | 29.823 |
| 0.8083333333333332 | 25.419 |
| 0.8090277777777778 | 21.024 |
| 0.8097222222222222 | 21.024 |
| 0.8104166666666667 | 16.636 |
| 0.811111111111111 | 16.636 |
| 0.8118055555555556 | 12.257 |
| 0.8125 | 12.257 |
| 0.8131944444444444 | 7.887 |
| 0.813888888888889 | 7.887 |
| 0.8145833333333333 | 7.887 |
| 0.8152777777777778 | 7.887 |
| 0.8159722222222222 | 7.887 |
| 0.8166666666666668 | 3.525 |
| 0.8173611111111111 | 3.525 |
| 0.8180555555555555 | 3.525 |
| 0.81875 | 3.525 |
| 0.8194444444444445 | 3.525 |
| 0.8201388888888889 | 3.525 |
| 0.8208333333333333 | 3.525 |
| 0.8215277777777777 | 3.525 |
| 0.8222222222222223 | 3.525 |
| 0.8229166666666666 | 3.525 |
| 0.8236111111111111 | 0 |
| 0.8243055555555556 | 0 |
| 0.8250000000000001 | 0 |
| 0.8256944444444444 | 0 |
| 0.8263888888888888 | 0 |
| 0.8270833333333334 | 0 |
| 0.8277777777777778 | 0 |
| 0.8284722222222222 | 0 |
| 0.8291666666666666 | 0 |
| 0.8298611111111112 | 0 |
| 0.8305555555555556 | 0 |
| 0.8312499999999999 | 0 |
| 0.8319444444444444 | 0 |
| 0.8326388888888889 | 0 |
| 0.8333333333333334 | 0 |
| 0.8340277777777777 | 0 |
| 0.8347222222222223 | 0 |
| 0.8354166666666667 | 0 |
| 0.8361111111111111 | 0 |
| 0.8368055555555555 | 0 |
| 0.8375 | 0 |
| 0.8381944444444445 | 0 |
| 0.8388888888888889 | 0 |
| 0.8395833333333332 | 0 |
| 0.8402777777777778 | 0 |
| 0.8409722222222222 | 0 |
| 0.8416666666666667 | 0 |
| 0.842361111111111 | 0 |
| 0.8430555555555556 | 0 |
| 0.84375 | 0 |
| 0.8444444444444444 | 0 |
| 0.845138888888889 | 0 |
| 0.8458333333333333 | 0 |
| 0.8465277777777778 | 0 |
| 0.8472222222222222 | 0 |
| 0.8479166666666668 | 0 |
| 0.8486111111111111 | 0 |
| 0.8493055555555555 | 0 |
| 0.85 | 0 |
| 0.8506944444444445 | 0 |
| 0.8513888888888889 | 0 |
| 0.8520833333333333 | 0 |
| 0.8527777777777777 | 0 |
| 0.8534722222222223 | 0 |
| 0.8541666666666666 | 0 |
| 0.8548611111111111 | 0 |
| 0.8555555555555556 | 0 |
| 0.8562500000000001 | 0 |
| 0.8569444444444444 | 0 |
| 0.8576388888888888 | 0 |
| 0.8583333333333334 | 0 |
| 0.8590277777777778 | 0 |
| 0.8597222222222222 | 0 |
| 0.8604166666666666 | 0 |
| 0.8611111111111112 | 0 |
| 0.8618055555555556 | 0 |
| 0.8624999999999999 | 0 |
| 0.8631944444444444 | 0 |
| 0.8638888888888889 | 0 |
| 0.8645833333333334 | 0 |
| 0.8652777777777777 | 0 |
| 0.8659722222222223 | 0 |
| 0.8666666666666667 | 0 |
| 0.8673611111111111 | 0 |
| 0.8680555555555555 | 0 |
| 0.86875 | 0 |
| 0.8694444444444445 | 0 |
| 0.8701388888888889 | 0 |
| 0.8708333333333332 | 0 |
| 0.8715277777777778 | 0 |
| 0.8722222222222222 | 0 |
| 0.8729166666666667 | 0 |
| 0.873611111111111 | 0 |
| 0.8743055555555556 | 0 |
| 0.875 | 0 |
| 0.8756944444444444 | 0 |
| 0.876388888888889 | 0 |
| 0.8770833333333333 | 0 |
| 0.8777777777777778 | 0 |
| 0.8784722222222222 | 0 |
| 0.8791666666666668 | 0 |
| 0.8798611111111111 | 0 |
| 0.8805555555555555 | 0 |
| 0.88125 | 0 |
| 0.8819444444444445 | 0 |
| 0.8826388888888889 | 0 |
| 0.8833333333333333 | 0 |
| 0.8840277777777777 | 0 |
| 0.8847222222222223 | 0 |
| 0.8854166666666666 | 0 |
| 0.8861111111111111 | 0 |
| 0.8868055555555556 | 0 |
| 0.8875000000000001 | 0 |
| 0.8881944444444444 | 0 |
| 0.8888888888888888 | 0 |
| 0.8895833333333334 | 0 |
| 0.8902777777777778 | 0 |
| 0.8909722222222222 | 0 |
| 0.8916666666666666 | 0 |
| 0.8923611111111112 | 0 |
| 0.8930555555555556 | 0 |
| 0.8937499999999999 | 0 |
| 0.8944444444444444 | 0 |
| 0.8951388888888889 | 0 |
| 0.8958333333333334 | 0 |
| 0.8965277777777777 | 0 |
| 0.8972222222222223 | 0 |
| 0.8979166666666667 | 0 |
| 0.8986111111111111 | 0 |
| 0.8993055555555555 | 0 |
| 0.9 | 0 |
| 0.9006944444444445 | 0 |
| 0.9013888888888889 | 0 |
| 0.9020833333333332 | 0 |
| 0.9027777777777778 | 0 |
| 0.9034722222222222 | 0 |
| 0.9041666666666667 | 0 |
| 0.904861111111111 | 0 |
| 0.9055555555555556 | 0 |
| 0.90625 | 0 |
| 0.9069444444444444 | 0 |
| 0.907638888888889 | 0 |
| 0.9083333333333333 | 0 |
| 0.9090277777777778 | 0 |
| 0.9097222222222222 | 0 |
| 0.9104166666666668 | 0 |
| 0.9111111111111111 | 0 |
| 0.9118055555555555 | 0 |
| 0.9125 | 0 |
| 0.9131944444444445 | 0 |
| 0.9138888888888889 | 0 |
| 0.9145833333333333 | 0 |
| 0.9152777777777777 | 0 |
| 0.9159722222222223 | 0 |
| 0.9166666666666666 | 0 |
| 0.9173611111111111 | 0 |
| 0.9180555555555556 | 0 |
| 0.9187500000000001 | 0 |
| 0.9194444444444444 | 0 |
| 0.9201388888888888 | 0 |
| 0.9208333333333334 | 0 |
| 0.9215277777777778 | 0 |
| 0.9222222222222222 | 0 |
| 0.9229166666666666 | 0 |
| 0.9236111111111112 | 0 |
| 0.9243055555555556 | 0 |
| 0.9249999999999999 | 0 |
| 0.9256944444444444 | 0 |
| 0.9263888888888889 | 0 |
| 0.9270833333333334 | 0 |
| 0.9277777777777777 | 0 |
| 0.9284722222222223 | 0 |
| 0.9291666666666667 | 0 |
| 0.9298611111111111 | 0 |
| 0.9305555555555555 | 0 |
| 0.93125 | 0 |
| 0.9319444444444445 | 0 |
| 0.9326388888888889 | 0 |
| 0.9333333333333332 | 0 |
| 0.9340277777777778 | 0 |
| 0.9347222222222222 | 0 |
| 0.9354166666666667 | 0 |
| 0.936111111111111 | 0 |
| 0.9368055555555556 | 0 |
| 0.9375 | 0 |
| 0.9381944444444444 | 0 |
| 0.938888888888889 | 0 |
| 0.9395833333333333 | 0 |
| 0.9402777777777778 | 0 |
| 0.9409722222222222 | 0 |
| 0.9416666666666668 | 0 |
| 0.9423611111111111 | 0 |
| 0.9430555555555555 | 0 |
| 0.94375 | 0 |
| 0.9444444444444445 | 0 |
| 0.9451388888888889 | 0 |
| 0.9458333333333333 | 0 |
| 0.9465277777777777 | 0 |
| 0.9472222222222223 | 0 |
| 0.9479166666666666 | 0 |
| 0.9486111111111111 | 0 |
| 0.9493055555555556 | 0 |
| 0.9500000000000001 | 0 |
| 0.9506944444444444 | 0 |
| 0.9513888888888888 | 0 |
| 0.9520833333333334 | 0 |
| 0.9527777777777778 | 0 |
| 0.9534722222222222 | 0 |
| 0.9541666666666666 | 0 |
| 0.9548611111111112 | 0 |
| 0.9555555555555556 | 0 |
| 0.9562499999999999 | 0 |
| 0.9569444444444444 | 0 |
| 0.9576388888888889 | 0 |
| 0.9583333333333334 | 0 |
| 0.9590277777777777 | 0 |
| 0.9597222222222223 | 0 |
| 0.9604166666666667 | 0 |
| 0.9611111111111111 | 0 |
| 0.9618055555555555 | 0 |
| 0.9625 | 0 |
| 0.9631944444444445 | 0 |
| 0.9638888888888889 | 0 |
| 0.9645833333333332 | 0 |
| 0.9652777777777778 | 0 |
| 0.9659722222222222 | 0 |
| 0.9666666666666667 | 0 |
| 0.967361111111111 | 0 |
| 0.9680555555555556 | 0 |
| 0.96875 | 0 |
| 0.9694444444444444 | 0 |
| 0.970138888888889 | 0 |
| 0.9708333333333333 | 0 |
| 0.9715277777777778 | 0 |
| 0.9722222222222222 | 0 |
| 0.9729166666666668 | 0 |
| 0.9736111111111111 | 0 |
| 0.9743055555555555 | 0 |
| 0.975 | 0 |
| 0.9756944444444445 | 0 |
| 0.9763888888888889 | 0 |
| 0.9770833333333333 | 0 |
| 0.9777777777777777 | 0 |
| 0.9784722222222223 | 0 |
| 0.9791666666666666 | 0 |
| 0.9798611111111111 | 0 |
| 0.9805555555555556 | 0 |
| 0.9812500000000001 | 0 |
| 0.9819444444444444 | 0 |
| 0.9826388888888888 | 0 |
| 0.9833333333333334 | 0 |
| 0.9840277777777778 | 0 |
| 0.9847222222222222 | 0 |
| 0.9854166666666666 | 0 |
| 0.9861111111111112 | 0 |
| 0.9868055555555556 | 0 |
| 0.9874999999999999 | 0 |
| 0.9881944444444444 | 0 |
| 0.9888888888888889 | 0 |
| 0.9895833333333334 | 0 |
| 0.9902777777777777 | 0 |
| 0.9909722222222223 | 0 |
| 0.9916666666666667 | 0 |
| 0.9923611111111111 | 0 |
| 0.9930555555555555 | 0 |
| 0.99375 | 0 |
| 0.9944444444444445 | 0 |
| 0.9951388888888889 | 0 |
| 0.9958333333333332 | 0 |
| 0.9965277777777778 | 0 |
| 0.9972222222222222 | 0 |
| 0.9979166666666667 | 0 |
| 0.998611111111111 | 0 |
| 0.9993055555555556 | 0 |